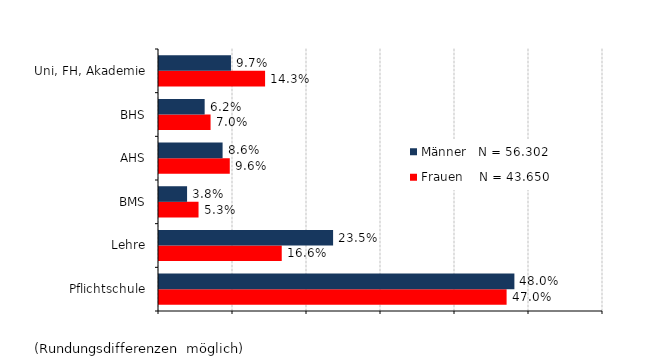
| Category | Frauen    N = 43.650 | Männer   N = 56.302 |
|---|---|---|
| Pflichtschule | 0.47 | 0.48 |
| Lehre | 0.166 | 0.235 |
| BMS | 0.053 | 0.038 |
| AHS | 0.096 | 0.086 |
| BHS | 0.07 | 0.062 |
| Uni, FH, Akademie | 0.143 | 0.097 |